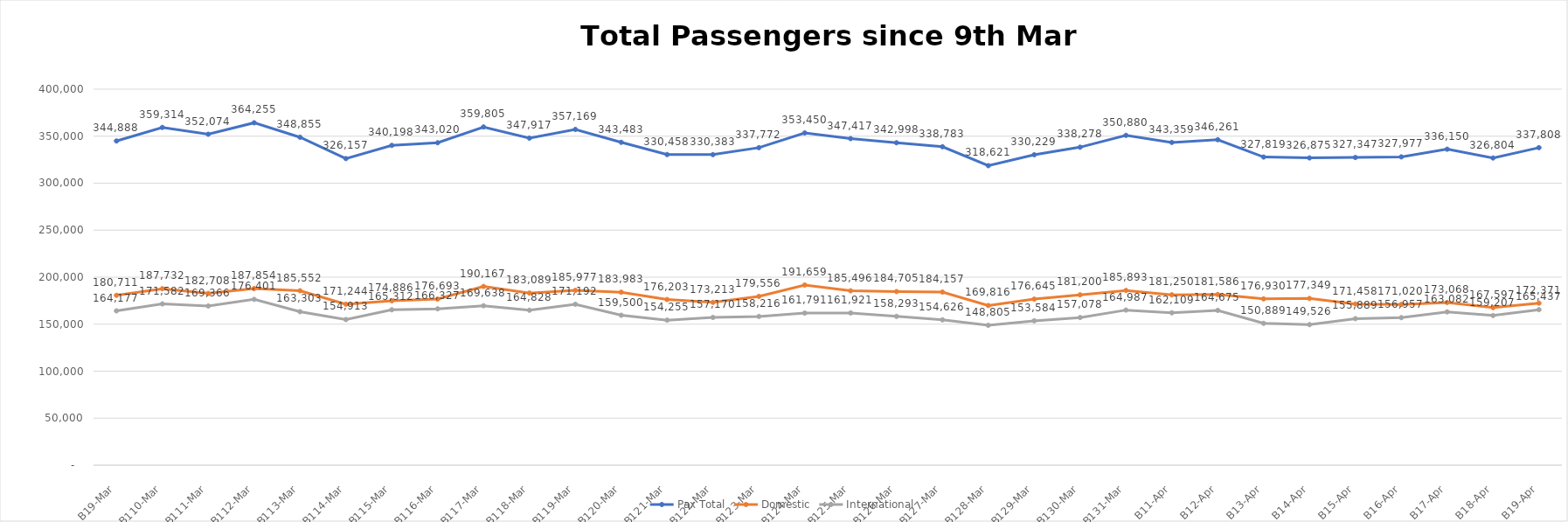
| Category | Pax Total |  Domestic  |  International  |
|---|---|---|---|
| 2023-03-09 | 344888 | 180711 | 164177 |
| 2023-03-10 | 359314 | 187732 | 171582 |
| 2023-03-11 | 352074 | 182708 | 169366 |
| 2023-03-12 | 364255 | 187854 | 176401 |
| 2023-03-13 | 348855 | 185552 | 163303 |
| 2023-03-14 | 326157 | 171244 | 154913 |
| 2023-03-15 | 340198 | 174886 | 165312 |
| 2023-03-16 | 343020 | 176693 | 166327 |
| 2023-03-17 | 359805 | 190167 | 169638 |
| 2023-03-18 | 347917 | 183089 | 164828 |
| 2023-03-19 | 357169 | 185977 | 171192 |
| 2023-03-20 | 343483 | 183983 | 159500 |
| 2023-03-21 | 330458 | 176203 | 154255 |
| 2023-03-22 | 330383 | 173213 | 157170 |
| 2023-03-23 | 337772 | 179556 | 158216 |
| 2023-03-24 | 353450 | 191659 | 161791 |
| 2023-03-25 | 347417 | 185496 | 161921 |
| 2023-03-26 | 342998 | 184705 | 158293 |
| 2023-03-27 | 338783 | 184157 | 154626 |
| 2023-03-28 | 318621 | 169816 | 148805 |
| 2023-03-29 | 330229 | 176645 | 153584 |
| 2023-03-30 | 338278 | 181200 | 157078 |
| 2023-03-31 | 350880 | 185893 | 164987 |
| 2023-04-01 | 343359 | 181250 | 162109 |
| 2023-04-02 | 346261 | 181586 | 164675 |
| 2023-04-03 | 327819 | 176930 | 150889 |
| 2023-04-04 | 326875 | 177349 | 149526 |
| 2023-04-05 | 327347 | 171458 | 155889 |
| 2023-04-06 | 327977 | 171020 | 156957 |
| 2023-04-07 | 336150 | 173068 | 163082 |
| 2023-04-08 | 326804 | 167597 | 159207 |
| 2023-04-09 | 337808 | 172371 | 165437 |